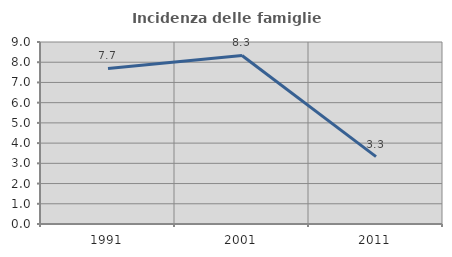
| Category | Incidenza delle famiglie numerose |
|---|---|
| 1991.0 | 7.692 |
| 2001.0 | 8.333 |
| 2011.0 | 3.333 |